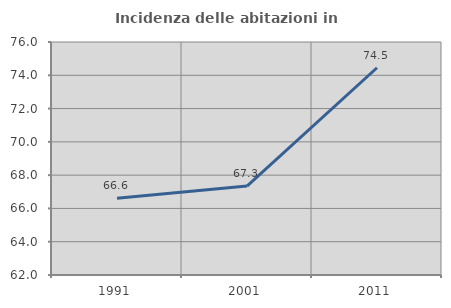
| Category | Incidenza delle abitazioni in proprietà  |
|---|---|
| 1991.0 | 66.61 |
| 2001.0 | 67.342 |
| 2011.0 | 74.452 |